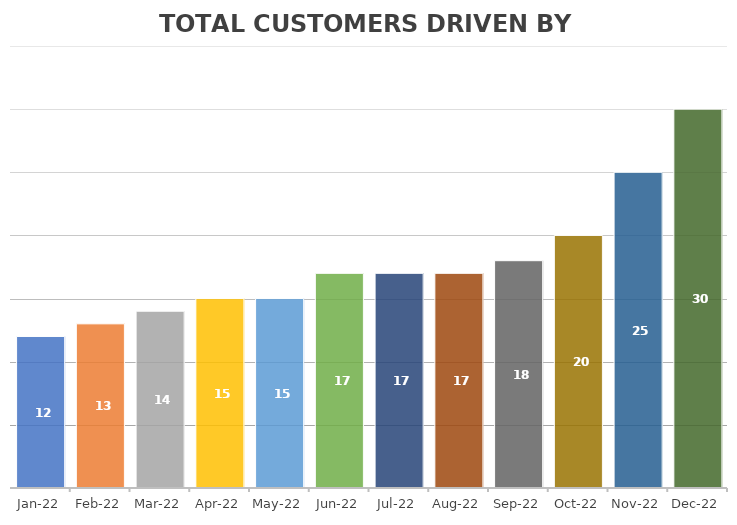
| Category | TOTAL |
|---|---|
| 2022-01-18 | 12 |
| 2022-02-18 | 13 |
| 2022-03-18 | 14 |
| 2022-04-18 | 15 |
| 2022-05-18 | 15 |
| 2022-06-18 | 17 |
| 2022-07-18 | 17 |
| 2022-08-18 | 17 |
| 2022-09-18 | 18 |
| 2022-10-18 | 20 |
| 2022-11-18 | 25 |
| 2022-12-18 | 30 |